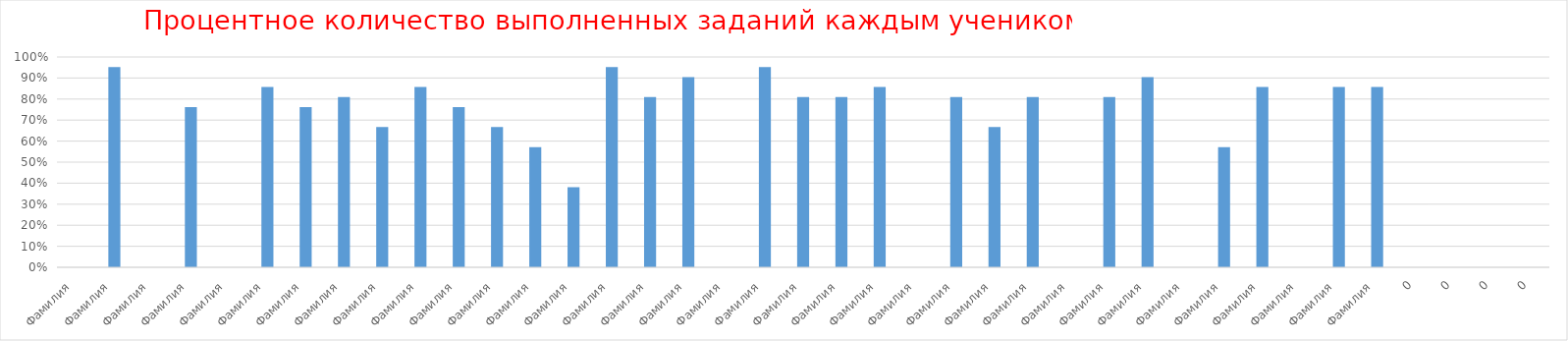
| Category | Series 0 |
|---|---|
| Фамилия  | 0 |
| Фамилия  | 0.952 |
| Фамилия  | 0 |
| Фамилия  | 0.762 |
| Фамилия  | 0 |
| Фамилия  | 0.857 |
| Фамилия  | 0.762 |
| Фамилия  | 0.81 |
| Фамилия  | 0.667 |
| Фамилия  | 0.857 |
| Фамилия  | 0.762 |
| Фамилия  | 0.667 |
| Фамилия  | 0.571 |
| Фамилия  | 0.381 |
| Фамилия  | 0.952 |
| Фамилия  | 0.81 |
| Фамилия  | 0.905 |
| Фамилия  | 0 |
| Фамилия  | 0.952 |
| Фамилия  | 0.81 |
| Фамилия  | 0.81 |
| Фамилия  | 0.857 |
| Фамилия  | 0 |
| Фамилия  | 0.81 |
| Фамилия  | 0.667 |
| Фамилия  | 0.81 |
| Фамилия  | 0 |
| Фамилия  | 0.81 |
| Фамилия  | 0.905 |
| Фамилия  | 0 |
| Фамилия  | 0.571 |
| Фамилия  | 0.857 |
| Фамилия  | 0 |
| Фамилия  | 0.857 |
| Фамилия  | 0.857 |
| 0 | 0 |
| 0 | 0 |
| 0 | 0 |
| 0 | 0 |